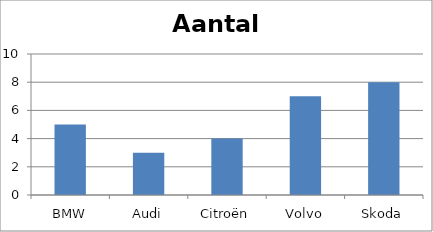
| Category | Aantal |
|---|---|
| BMW | 5 |
| Audi | 3 |
| Citroën | 4 |
| Volvo | 7 |
| Skoda | 8 |